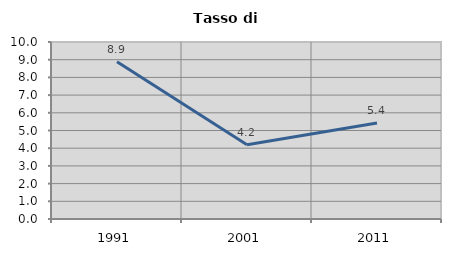
| Category | Tasso di disoccupazione   |
|---|---|
| 1991.0 | 8.889 |
| 2001.0 | 4.192 |
| 2011.0 | 5.422 |